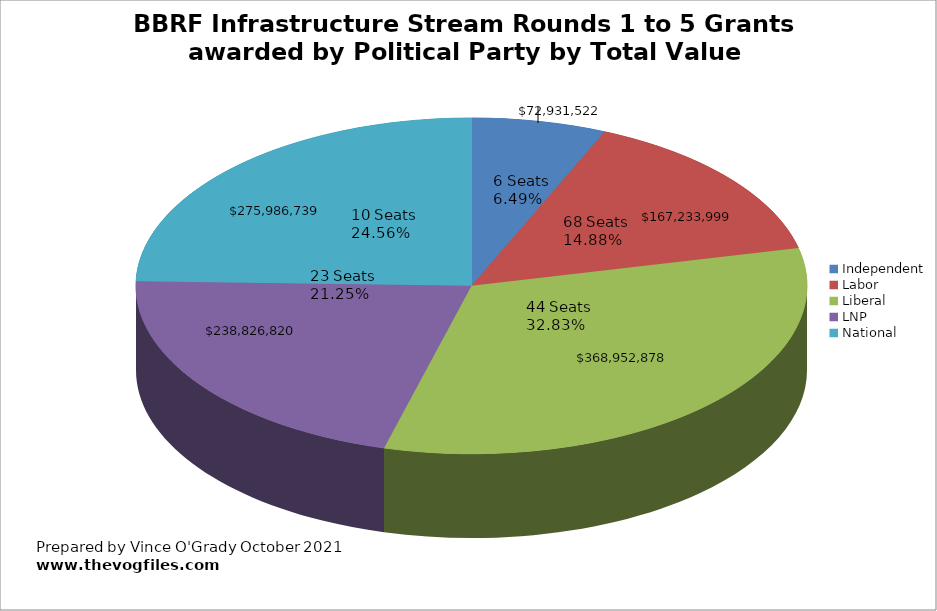
| Category | BBRF Infrastructure Stream Rounds 1 to 5 Grants awarded by Political Party by number |
|---|---|
| Independent | 72931522 |
| Labor | 167233999 |
| Liberal | 368952878 |
| LNP | 238826820 |
| National | 275986739 |